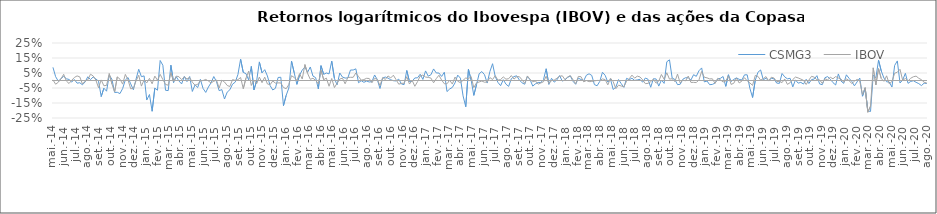
| Category | CSMG3 | IBOV |
|---|---|---|
| 2014-05-19 | 0.088 | 0.004 |
| 2014-05-26 | 0.025 | -0.025 |
| 2014-06-02 | -0.005 | -0.012 |
| 2014-06-09 | 0.013 | 0.011 |
| 2014-06-16 | 0.028 | 0.041 |
| 2014-06-23 | 0.012 | -0.004 |
| 2014-06-30 | 0.007 | -0.02 |
| 2014-07-07 | -0.01 | 0.001 |
| 2014-07-14 | 0.006 | 0.02 |
| 2014-07-21 | -0.018 | 0.031 |
| 2014-07-28 | -0.015 | 0.024 |
| 2014-08-04 | -0.028 | -0.023 |
| 2014-08-11 | -0.009 | -0.005 |
| 2014-08-18 | 0.025 | 0.004 |
| 2014-08-25 | 0.006 | 0.042 |
| 2014-09-01 | 0.024 | 0.03 |
| 2014-09-08 | 0.011 | 0.003 |
| 2014-09-15 | -0.004 | -0.048 |
| 2014-09-22 | -0.107 | 0.004 |
| 2014-09-29 | -0.052 | -0.035 |
| 2014-10-06 | -0.071 | -0.033 |
| 2014-10-13 | 0.036 | 0.046 |
| 2014-10-20 | 0.008 | -0.023 |
| 2014-10-27 | -0.08 | -0.076 |
| 2014-11-03 | -0.079 | 0.024 |
| 2014-11-10 | -0.087 | 0.009 |
| 2014-11-17 | -0.054 | -0.024 |
| 2014-11-24 | 0.003 | 0.041 |
| 2014-12-01 | 0.02 | 0.004 |
| 2014-12-08 | -0.022 | -0.055 |
| 2014-12-15 | -0.062 | -0.052 |
| 2014-12-22 | 0.009 | -0.003 |
| 2014-12-29 | 0.075 | 0.035 |
| 2015-01-05 | 0.025 | -0.038 |
| 2015-01-12 | 0.031 | 0.004 |
| 2015-01-19 | -0.13 | -0.016 |
| 2015-01-26 | -0.093 | 0.014 |
| 2015-02-02 | -0.205 | -0.022 |
| 2015-02-09 | -0.051 | 0.029 |
| 2015-02-16 | -0.065 | 0.002 |
| 2015-02-23 | 0.133 | 0.041 |
| 2015-03-02 | 0.101 | 0.007 |
| 2015-03-09 | -0.065 | -0.027 |
| 2015-03-16 | -0.067 | -0.031 |
| 2015-03-23 | 0.102 | 0.052 |
| 2015-03-30 | -0.014 | -0.005 |
| 2015-04-06 | 0.025 | 0.029 |
| 2015-04-13 | -0.003 | 0.025 |
| 2015-04-20 | -0.023 | 0.006 |
| 2015-04-27 | 0.027 | 0.025 |
| 2015-05-04 | -0.007 | 0.01 |
| 2015-05-11 | 0.027 | 0.019 |
| 2015-05-18 | -0.073 | -0.011 |
| 2015-05-25 | -0.029 | -0.031 |
| 2015-06-01 | -0.047 | -0.025 |
| 2015-06-08 | 0.008 | -0.003 |
| 2015-06-15 | -0.053 | 0 |
| 2015-06-22 | -0.079 | 0.007 |
| 2015-06-29 | -0.043 | -0.004 |
| 2015-07-06 | -0.015 | -0.016 |
| 2015-07-13 | 0.026 | -0.005 |
| 2015-07-20 | -0.008 | 0.003 |
| 2015-07-27 | -0.068 | -0.051 |
| 2015-08-03 | -0.061 | 0.002 |
| 2015-08-10 | -0.123 | -0.01 |
| 2015-08-17 | -0.078 | -0.033 |
| 2015-08-24 | -0.062 | -0.04 |
| 2015-08-31 | -0.024 | 0.006 |
| 2015-09-07 | -0.011 | 0.001 |
| 2015-09-14 | 0.04 | 0.006 |
| 2015-09-21 | 0.142 | 0.02 |
| 2015-09-28 | 0.054 | -0.054 |
| 2015-10-05 | 0.046 | 0.015 |
| 2015-10-12 | 0.004 | 0.062 |
| 2015-10-19 | 0.094 | -0.033 |
| 2015-10-26 | -0.062 | 0.003 |
| 2015-11-02 | -0.001 | -0.022 |
| 2015-11-09 | 0.124 | 0.023 |
| 2015-11-16 | 0.051 | -0.015 |
| 2015-11-23 | 0.072 | 0.022 |
| 2015-11-30 | 0.031 | -0.023 |
| 2015-12-07 | -0.034 | -0.028 |
| 2015-12-14 | -0.063 | -0.003 |
| 2015-12-21 | -0.052 | -0.018 |
| 2015-12-28 | 0.02 | -0.016 |
| 2016-01-04 | 0.022 | -0.016 |
| 2016-01-11 | -0.168 | -0.047 |
| 2016-01-18 | -0.099 | -0.055 |
| 2016-01-25 | -0.05 | -0.027 |
| 2016-02-01 | 0.129 | 0.032 |
| 2016-02-08 | 0.051 | 0.02 |
| 2016-02-15 | -0.026 | 0 |
| 2016-02-22 | 0.036 | 0.046 |
| 2016-02-29 | 0.07 | 0.01 |
| 2016-03-07 | 0.089 | 0.106 |
| 2016-03-14 | 0.055 | 0.047 |
| 2016-03-21 | 0.09 | 0.008 |
| 2016-03-28 | 0.029 | 0.015 |
| 2016-04-04 | 0.019 | 0.001 |
| 2016-04-11 | -0.056 | -0.023 |
| 2016-04-18 | 0.099 | 0.069 |
| 2016-04-25 | 0.041 | 0.005 |
| 2016-05-02 | 0.05 | 0.016 |
| 2016-05-09 | 0.044 | -0.038 |
| 2016-05-16 | 0.129 | 0.013 |
| 2016-05-23 | 0.014 | -0.047 |
| 2016-05-30 | -0.029 | -0.018 |
| 2016-06-06 | 0.05 | 0.01 |
| 2016-06-13 | 0.023 | 0.016 |
| 2016-06-20 | 0.016 | -0.022 |
| 2016-06-27 | 0.017 | 0.02 |
| 2016-07-04 | 0.07 | 0.021 |
| 2016-07-11 | 0.07 | 0.021 |
| 2016-07-18 | 0.078 | 0.05 |
| 2016-07-25 | -0.015 | 0.026 |
| 2016-08-01 | -0.001 | 0.002 |
| 2016-08-08 | -0.012 | 0.006 |
| 2016-08-15 | -0.004 | 0.015 |
| 2016-08-22 | -0.01 | 0.013 |
| 2016-08-29 | -0.008 | -0.015 |
| 2016-09-05 | 0.037 | 0.014 |
| 2016-09-12 | 0.006 | 0.008 |
| 2016-09-19 | -0.053 | -0.034 |
| 2016-09-26 | 0.017 | 0.02 |
| 2016-10-03 | 0.023 | 0.007 |
| 2016-10-10 | 0.016 | 0.03 |
| 2016-10-17 | 0.005 | 0.017 |
| 2016-10-24 | -0.001 | 0.035 |
| 2016-10-31 | -0.003 | 0.006 |
| 2016-11-07 | 0.009 | -0.024 |
| 2016-11-14 | -0.023 | -0.019 |
| 2016-11-21 | -0.027 | -0.018 |
| 2016-11-28 | 0.067 | 0.025 |
| 2016-12-05 | -0.006 | -0.024 |
| 2016-12-12 | -0.005 | 0.001 |
| 2016-12-19 | 0.017 | -0.039 |
| 2016-12-26 | 0.018 | -0.008 |
| 2017-01-02 | 0.042 | 0.03 |
| 2017-01-09 | 0.007 | 0.036 |
| 2017-01-16 | 0.064 | 0.023 |
| 2017-01-23 | 0.029 | 0.021 |
| 2017-01-30 | 0.038 | 0.016 |
| 2017-02-06 | 0.077 | -0.015 |
| 2017-02-13 | 0.05 | 0.012 |
| 2017-02-20 | 0.05 | 0.035 |
| 2017-02-27 | 0.027 | 0.003 |
| 2017-03-06 | 0.055 | -0.022 |
| 2017-03-13 | -0.074 | -0.022 |
| 2017-03-20 | -0.057 | 0.002 |
| 2017-03-27 | -0.046 | -0.024 |
| 2017-04-03 | -0.016 | 0.023 |
| 2017-04-10 | 0.036 | -0.005 |
| 2017-04-17 | 0.016 | -0.015 |
| 2017-04-24 | -0.102 | 0.001 |
| 2017-05-01 | -0.175 | 0.017 |
| 2017-05-08 | 0.074 | 0.012 |
| 2017-05-15 | 0.004 | 0.027 |
| 2017-05-22 | -0.099 | -0.048 |
| 2017-05-29 | -0.029 | -0.016 |
| 2017-06-05 | 0.045 | -0.01 |
| 2017-06-12 | 0.06 | -0.004 |
| 2017-06-19 | 0.039 | -0.011 |
| 2017-06-26 | -0.017 | -0.01 |
| 2017-07-03 | 0.059 | 0.02 |
| 2017-07-10 | 0.112 | 0.007 |
| 2017-07-17 | 0.026 | 0.032 |
| 2017-07-24 | -0.013 | 0.002 |
| 2017-07-31 | -0.035 | 0.007 |
| 2017-08-07 | 0.005 | 0.024 |
| 2017-08-14 | -0.024 | 0.009 |
| 2017-08-21 | -0.039 | 0.012 |
| 2017-08-28 | 0.012 | 0.033 |
| 2017-09-04 | 0.026 | 0.01 |
| 2017-09-11 | 0.031 | 0.025 |
| 2017-09-18 | 0.003 | 0.026 |
| 2017-09-25 | -0.016 | 0.004 |
| 2017-10-02 | -0.025 | -0.019 |
| 2017-10-09 | 0.028 | 0.03 |
| 2017-10-16 | 0.005 | 0.007 |
| 2017-10-23 | -0.037 | -0.009 |
| 2017-10-30 | -0.022 | -0.003 |
| 2017-11-06 | -0.013 | -0.025 |
| 2017-11-13 | -0.013 | -0.017 |
| 2017-11-20 | 0.006 | -0.008 |
| 2017-11-27 | 0.078 | 0.029 |
| 2017-12-04 | -0.026 | -0.021 |
| 2017-12-11 | 0.014 | -0.001 |
| 2017-12-18 | -0.011 | 0.003 |
| 2017-12-25 | 0.004 | 0.015 |
| 2018-01-01 | 0.033 | 0.027 |
| 2018-01-08 | -0.004 | 0.032 |
| 2018-01-15 | 0.003 | 0.006 |
| 2018-01-22 | 0.02 | 0.023 |
| 2018-01-29 | 0.031 | 0.032 |
| 2018-02-05 | -0.005 | 0.006 |
| 2018-02-12 | -0.025 | -0.023 |
| 2018-02-19 | 0.016 | 0.027 |
| 2018-02-26 | 0.006 | 0.025 |
| 2018-03-05 | -0.002 | -0.009 |
| 2018-03-12 | 0.035 | 0 |
| 2018-03-19 | 0.045 | -0.008 |
| 2018-03-26 | 0.034 | -0.007 |
| 2018-04-02 | -0.027 | -0.003 |
| 2018-04-09 | -0.035 | 0 |
| 2018-04-16 | -0.006 | 0 |
| 2018-04-23 | 0.055 | 0.01 |
| 2018-04-30 | 0.034 | 0.006 |
| 2018-05-07 | -0.011 | -0.029 |
| 2018-05-14 | 0.009 | 0.015 |
| 2018-05-21 | -0.06 | -0.008 |
| 2018-05-28 | -0.044 | -0.054 |
| 2018-06-04 | 0.006 | -0.031 |
| 2018-06-11 | -0.021 | -0.037 |
| 2018-06-18 | -0.046 | -0.041 |
| 2018-06-25 | 0.014 | -0.005 |
| 2018-07-02 | 0.006 | 0.012 |
| 2018-07-09 | 0.015 | 0.036 |
| 2018-07-16 | 0.001 | 0.016 |
| 2018-07-23 | 0.004 | 0.029 |
| 2018-07-30 | 0.008 | 0.024 |
| 2018-08-06 | -0.012 | 0.004 |
| 2018-08-13 | 0.016 | -0.021 |
| 2018-08-20 | 0.008 | -0.019 |
| 2018-08-27 | -0.045 | -0.008 |
| 2018-09-03 | 0.012 | 0.008 |
| 2018-09-10 | 0.01 | -0.018 |
| 2018-09-17 | -0.037 | -0.004 |
| 2018-09-24 | 0.003 | 0.04 |
| 2018-10-01 | -0.019 | 0.008 |
| 2018-10-08 | 0.125 | 0.052 |
| 2018-10-15 | 0.138 | 0.009 |
| 2018-10-22 | 0.017 | 0.012 |
| 2018-10-29 | 0.007 | -0.008 |
| 2018-11-05 | -0.028 | 0.043 |
| 2018-11-12 | -0.025 | -0.017 |
| 2018-11-19 | 0.009 | 0.002 |
| 2018-11-26 | 0.018 | -0.002 |
| 2018-12-03 | 0.018 | 0.03 |
| 2018-12-10 | 0.003 | -0.013 |
| 2018-12-17 | 0.039 | -0.012 |
| 2018-12-24 | 0.028 | -0.014 |
| 2018-12-31 | 0.065 | 0.004 |
| 2019-01-07 | 0.084 | 0.06 |
| 2019-01-14 | -0.009 | 0.021 |
| 2019-01-21 | -0.003 | 0.018 |
| 2019-01-28 | -0.028 | 0.011 |
| 2019-02-04 | -0.026 | 0.011 |
| 2019-02-11 | -0.017 | -0.019 |
| 2019-02-18 | 0.01 | 0.014 |
| 2019-02-25 | 0.014 | 0.005 |
| 2019-03-04 | 0.027 | -0.01 |
| 2019-03-11 | -0.039 | -0.004 |
| 2019-03-18 | 0.038 | 0.031 |
| 2019-03-25 | -0.006 | -0.026 |
| 2019-04-01 | 0.007 | -0.018 |
| 2019-04-08 | 0.017 | 0.016 |
| 2019-04-15 | 0.008 | -0.016 |
| 2019-04-22 | 0.003 | -0.004 |
| 2019-04-29 | 0.038 | 0.019 |
| 2019-05-06 | 0.038 | -0.003 |
| 2019-05-13 | -0.052 | -0.017 |
| 2019-05-20 | -0.113 | -0.033 |
| 2019-05-27 | 0.002 | 0.034 |
| 2019-06-03 | 0.055 | 0.028 |
| 2019-06-10 | 0.07 | 0.003 |
| 2019-06-17 | 0.005 | 0.012 |
| 2019-06-24 | 0.015 | 0.026 |
| 2019-07-01 | -0.004 | -0.002 |
| 2019-07-08 | 0.015 | 0.022 |
| 2019-07-15 | 0.011 | 0.016 |
| 2019-07-22 | -0.017 | -0.007 |
| 2019-07-29 | -0.019 | -0.006 |
| 2019-08-05 | 0.047 | -0.014 |
| 2019-08-12 | 0.024 | 0.01 |
| 2019-08-19 | 0.011 | -0.026 |
| 2019-08-26 | 0.015 | -0.015 |
| 2019-09-02 | -0.043 | 0.006 |
| 2019-09-09 | 0.004 | 0.023 |
| 2019-09-16 | -0.018 | 0.017 |
| 2019-09-23 | -0.013 | 0.009 |
| 2019-09-30 | -0.024 | 0.001 |
| 2019-10-07 | 0.008 | -0.027 |
| 2019-10-14 | -0.02 | 0.003 |
| 2019-10-21 | 0.006 | 0.028 |
| 2019-10-28 | 0.01 | 0.022 |
| 2019-11-04 | 0.032 | 0.005 |
| 2019-11-11 | -0.023 | 0.004 |
| 2019-11-18 | -0.028 | -0.019 |
| 2019-11-25 | 0.019 | 0.011 |
| 2019-12-02 | 0.026 | 0.005 |
| 2019-12-09 | 0.009 | 0.021 |
| 2019-12-16 | -0.014 | 0.011 |
| 2019-12-23 | -0.03 | 0.026 |
| 2019-12-30 | 0.044 | 0.017 |
| 2020-01-06 | -0.004 | 0.01 |
| 2020-01-13 | -0.019 | -0.012 |
| 2020-01-20 | 0.038 | 0.011 |
| 2020-01-27 | 0.015 | 0 |
| 2020-02-03 | -0.006 | -0.021 |
| 2020-02-10 | -0.036 | -0.005 |
| 2020-02-17 | -0.009 | 0.007 |
| 2020-02-24 | 0.016 | -0.005 |
| 2020-03-02 | -0.105 | -0.094 |
| 2020-03-09 | -0.051 | -0.047 |
| 2020-03-16 | -0.203 | -0.212 |
| 2020-03-23 | -0.206 | -0.171 |
| 2020-03-30 | 0.036 | 0.084 |
| 2020-04-06 | 0.019 | -0.029 |
| 2020-04-13 | 0.135 | 0.079 |
| 2020-04-20 | 0.064 | 0.013 |
| 2020-04-27 | 0.016 | -0.005 |
| 2020-05-04 | -0.009 | 0.031 |
| 2020-05-11 | -0.01 | -0.022 |
| 2020-05-18 | -0.044 | -0.007 |
| 2020-05-25 | 0.1 | 0.048 |
| 2020-06-01 | 0.13 | 0.055 |
| 2020-06-08 | -0.017 | 0.075 |
| 2020-06-15 | 0.003 | 0.001 |
| 2020-06-22 | 0.048 | 0.013 |
| 2020-06-29 | -0.019 | -0.003 |
| 2020-07-06 | -0.006 | 0.015 |
| 2020-07-13 | -0.002 | 0.025 |
| 2020-07-20 | -0.012 | 0.029 |
| 2020-07-27 | -0.021 | 0.015 |
| 2020-08-03 | -0.034 | 0.005 |
| 2020-08-10 | -0.018 | -0.012 |
| 2020-08-17 | -0.02 | -0.017 |